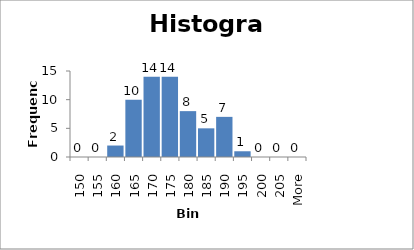
| Category | SŪ |
|---|---|
| 150 | 0 |
| 155 | 0 |
| 160 | 2 |
| 165 | 10 |
| 170 | 14 |
| 175 | 14 |
| 180 | 8 |
| 185 | 5 |
| 190 | 7 |
| 195 | 1 |
| 200 | 0 |
| 205 | 0 |
| More | 0 |